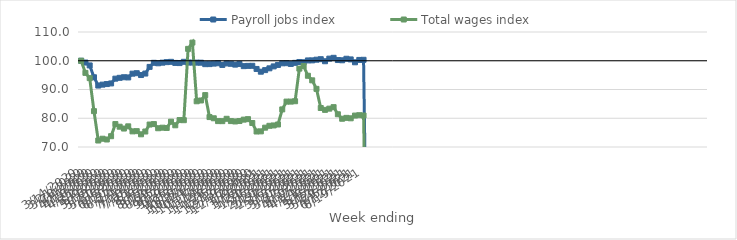
| Category | Payroll jobs index | Total wages index |
|---|---|---|
| 14/03/2020 | 100 | 100 |
| 21/03/2020 | 99.378 | 95.783 |
| 28/03/2020 | 98.372 | 93.956 |
| 04/04/2020 | 94.254 | 82.469 |
| 11/04/2020 | 91.374 | 72.252 |
| 18/04/2020 | 91.69 | 72.875 |
| 25/04/2020 | 91.894 | 72.611 |
| 02/05/2020 | 92.111 | 73.757 |
| 09/05/2020 | 93.767 | 77.975 |
| 16/05/2020 | 94.063 | 77.059 |
| 23/05/2020 | 94.263 | 76.419 |
| 30/05/2020 | 94.197 | 77.189 |
| 06/06/2020 | 95.506 | 75.436 |
| 13/06/2020 | 95.67 | 75.513 |
| 20/06/2020 | 95.029 | 74.413 |
| 27/06/2020 | 95.547 | 75.382 |
| 04/07/2020 | 97.862 | 77.814 |
| 11/07/2020 | 99.284 | 77.975 |
| 18/07/2020 | 99.116 | 76.526 |
| 25/07/2020 | 99.332 | 76.714 |
| 01/08/2020 | 99.517 | 76.622 |
| 08/08/2020 | 99.621 | 78.805 |
| 15/08/2020 | 99.242 | 77.551 |
| 22/08/2020 | 99.186 | 79.362 |
| 29/08/2020 | 99.633 | 79.326 |
| 05/09/2020 | 99.368 | 104.134 |
| 12/09/2020 | 99.36 | 106.305 |
| 19/09/2020 | 99.338 | 85.907 |
| 26/09/2020 | 99.325 | 86.183 |
| 03/10/2020 | 98.812 | 88.045 |
| 10/10/2020 | 98.836 | 80.409 |
| 17/10/2020 | 99.008 | 79.99 |
| 24/10/2020 | 99.126 | 79.006 |
| 31/10/2020 | 98.541 | 78.993 |
| 07/11/2020 | 99.068 | 79.81 |
| 14/11/2020 | 98.936 | 79.015 |
| 21/11/2020 | 98.657 | 78.885 |
| 28/11/2020 | 98.883 | 79.037 |
| 05/12/2020 | 98.128 | 79.52 |
| 12/12/2020 | 98.215 | 79.685 |
| 19/12/2020 | 98.24 | 78.346 |
| 26/12/2020 | 97.148 | 75.388 |
| 02/01/2021 | 96.19 | 75.436 |
| 09/01/2021 | 96.743 | 76.725 |
| 16/01/2021 | 97.367 | 77.372 |
| 23/01/2021 | 98.037 | 77.495 |
| 30/01/2021 | 98.543 | 77.829 |
| 06/02/2021 | 99.108 | 83.08 |
| 13/02/2021 | 99.155 | 85.793 |
| 20/02/2021 | 98.889 | 85.79 |
| 27/02/2021 | 99.269 | 85.918 |
| 06/03/2021 | 99.566 | 97.263 |
| 13/03/2021 | 99.483 | 98.144 |
| 20/03/2021 | 100.111 | 94.781 |
| 27/03/2021 | 100.132 | 93.185 |
| 03/04/2021 | 100.369 | 90.223 |
| 10/04/2021 | 100.539 | 83.56 |
| 17/04/2021 | 99.828 | 82.915 |
| 24/04/2021 | 100.735 | 83.338 |
| 01/05/2021 | 101.02 | 83.859 |
| 08/05/2021 | 100.245 | 81.387 |
| 15/05/2021 | 100.168 | 79.828 |
| 22/05/2021 | 100.691 | 80.133 |
| 29/05/2021 | 100.464 | 79.98 |
| 05/06/2021 | 99.465 | 80.933 |
| 12/06/2021 | 100.284 | 81.065 |
| 19/06/2021 | 100.329 | 80.966 |